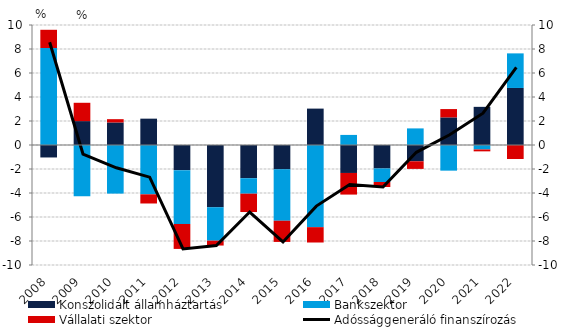
| Category | Konszolidált államháztartás | Bankszektor | Vállalati szektor |
|---|---|---|---|
| 2008.0 | -1.039 | 8.081 | 1.52 |
| 2009.0 | 1.991 | -4.272 | 1.527 |
| 2010.0 | 1.878 | -4.05 | 0.275 |
| 2011.0 | 2.195 | -4.111 | -0.763 |
| 2012.0 | -2.096 | -4.484 | -2.08 |
| 2013.0 | -5.186 | -2.785 | -0.407 |
| 2014.0 | -2.768 | -1.289 | -1.529 |
| 2015.0 | -2.027 | -4.284 | -1.766 |
| 2016.0 | 3.033 | -6.848 | -1.277 |
| 2017.0 | -2.331 | 0.84 | -1.801 |
| 2018.0 | -1.954 | -1.129 | -0.417 |
| 2019.0 | -1.358 | 1.383 | -0.634 |
| 2020.0 | 2.301 | -2.137 | 0.693 |
| 2021.0 | 3.179 | -0.372 | -0.157 |
| 2022.0 | 4.753 | 2.882 | -1.165 |